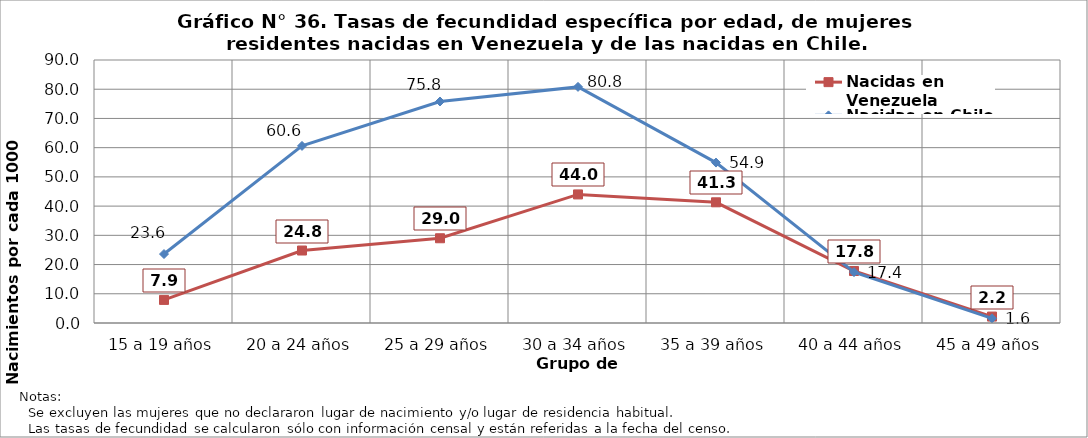
| Category | Nacidas en Venezuela | Nacidas en Chile |
|---|---|---|
| 15 a 19 años | 7.9 | 23.6 |
| 20 a 24 años | 24.8 | 60.6 |
| 25 a 29 años | 29 | 75.8 |
| 30 a 34 años | 44 | 80.8 |
| 35 a 39 años | 41.3 | 54.9 |
| 40 a 44 años | 17.8 | 17.4 |
| 45 a 49 años | 2.2 | 1.6 |